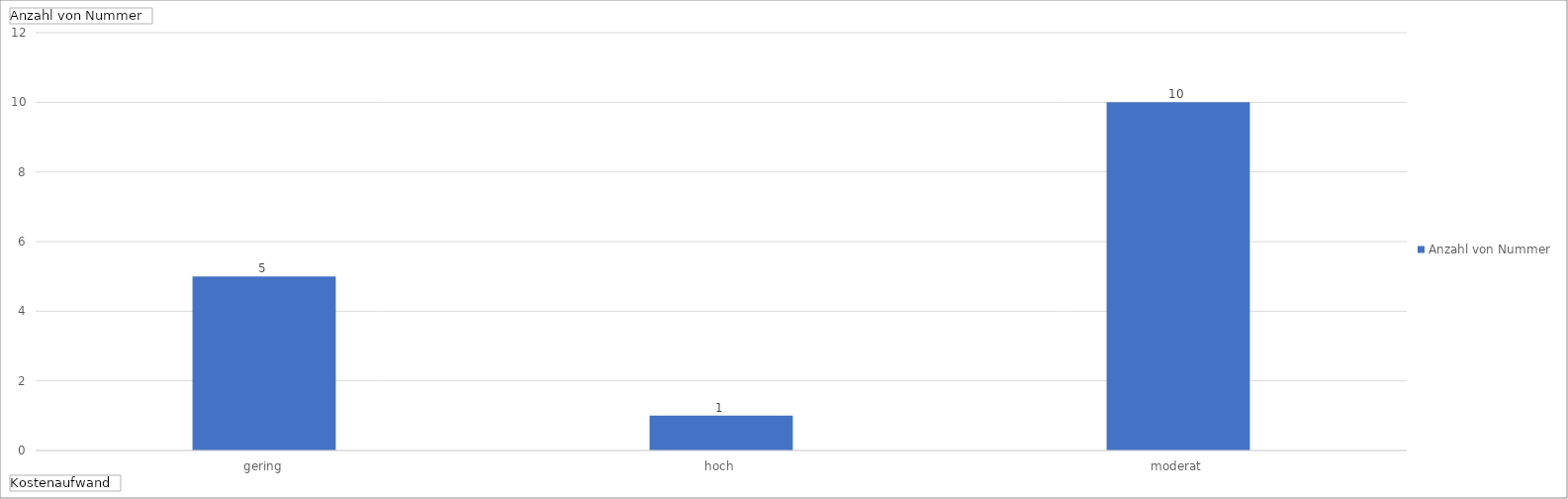
| Category | Ergebnis |
|---|---|
| gering | 5 |
| hoch | 1 |
| moderat | 10 |